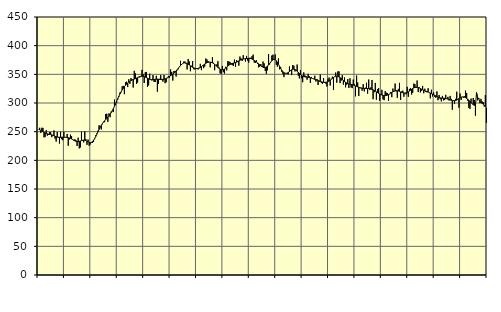
| Category | Piggar | Series 1 |
|---|---|---|
| nan | 254.1 | 253.97 |
| 87.0 | 256.7 | 253.22 |
| 87.0 | 247.8 | 252.1 |
| 87.0 | 256.9 | 250.87 |
| 87.0 | 256.5 | 249.75 |
| 87.0 | 240 | 248.64 |
| 87.0 | 240.9 | 247.76 |
| 87.0 | 252.5 | 246.95 |
| 87.0 | 243 | 246.3 |
| 87.0 | 244.2 | 245.82 |
| 87.0 | 249.1 | 245.36 |
| 87.0 | 249 | 244.92 |
| nan | 240.5 | 244.38 |
| 88.0 | 243 | 243.71 |
| 88.0 | 252 | 242.91 |
| 88.0 | 237.9 | 242.04 |
| 88.0 | 232.8 | 241.24 |
| 88.0 | 249.3 | 240.66 |
| 88.0 | 239.3 | 240.33 |
| 88.0 | 229.3 | 240.18 |
| 88.0 | 249.7 | 240.14 |
| 88.0 | 236.9 | 240.21 |
| 88.0 | 235.1 | 240.29 |
| 88.0 | 249.8 | 240.31 |
| nan | 240.3 | 240.29 |
| 89.0 | 240.4 | 240.16 |
| 89.0 | 246 | 239.9 |
| 89.0 | 225.5 | 239.55 |
| 89.0 | 236.3 | 239.02 |
| 89.0 | 244.7 | 238.26 |
| 89.0 | 242.1 | 237.3 |
| 89.0 | 235.6 | 236.18 |
| 89.0 | 234.3 | 235.02 |
| 89.0 | 237 | 233.95 |
| 89.0 | 235 | 233.15 |
| 89.0 | 225 | 232.72 |
| nan | 239.4 | 232.67 |
| 90.0 | 220.8 | 233.01 |
| 90.0 | 222.5 | 233.62 |
| 90.0 | 250 | 234.34 |
| 90.0 | 234.2 | 235 |
| 90.0 | 231.4 | 235.3 |
| 90.0 | 250.5 | 235.08 |
| 90.0 | 237 | 234.37 |
| 90.0 | 227 | 233.3 |
| 90.0 | 236.3 | 232.1 |
| 90.0 | 225.3 | 231.14 |
| 90.0 | 227.7 | 230.77 |
| nan | 230.2 | 231.25 |
| 91.0 | 230.3 | 232.69 |
| 91.0 | 232 | 235.08 |
| 91.0 | 237 | 238.16 |
| 91.0 | 243.7 | 241.76 |
| 91.0 | 246.8 | 245.72 |
| 91.0 | 251.7 | 249.81 |
| 91.0 | 261.1 | 253.78 |
| 91.0 | 257.1 | 257.51 |
| 91.0 | 253.9 | 260.95 |
| 91.0 | 263 | 263.95 |
| 91.0 | 267.2 | 266.57 |
| nan | 266.5 | 268.9 |
| 92.0 | 280.8 | 271.06 |
| 92.0 | 281.3 | 273.2 |
| 92.0 | 267.2 | 275.41 |
| 92.0 | 282 | 277.79 |
| 92.0 | 275.2 | 280.37 |
| 92.0 | 285 | 283.23 |
| 92.0 | 285.6 | 286.49 |
| 92.0 | 284.1 | 290.18 |
| 92.0 | 306 | 294.26 |
| 92.0 | 296.8 | 298.68 |
| 92.0 | 300.4 | 303.21 |
| nan | 306 | 307.69 |
| 93.0 | 310.7 | 311.95 |
| 93.0 | 318.4 | 315.86 |
| 93.0 | 318.7 | 319.5 |
| 93.0 | 329.1 | 322.84 |
| 93.0 | 329.8 | 325.78 |
| 93.0 | 315.4 | 328.39 |
| 93.0 | 335.9 | 330.75 |
| 93.0 | 337.2 | 332.88 |
| 93.0 | 327.8 | 334.78 |
| 93.0 | 341.4 | 336.42 |
| 93.0 | 333.6 | 337.82 |
| nan | 343.4 | 338.98 |
| 94.0 | 341.2 | 340.01 |
| 94.0 | 327 | 340.92 |
| 94.0 | 356.1 | 341.71 |
| 94.0 | 351.7 | 342.5 |
| 94.0 | 333.2 | 343.4 |
| 94.0 | 335.6 | 344.36 |
| 94.0 | 345.6 | 345.29 |
| 94.0 | 344.6 | 346.03 |
| 94.0 | 346.5 | 346.47 |
| 94.0 | 357.8 | 346.61 |
| 94.0 | 350.2 | 346.41 |
| nan | 334.9 | 345.9 |
| 95.0 | 353.7 | 345.1 |
| 95.0 | 354.2 | 344.17 |
| 95.0 | 328.1 | 343.2 |
| 95.0 | 330.6 | 342.2 |
| 95.0 | 351.1 | 341.38 |
| 95.0 | 341 | 340.9 |
| 95.0 | 339.2 | 340.71 |
| 95.0 | 348.6 | 340.76 |
| 95.0 | 336.7 | 340.99 |
| 95.0 | 336.7 | 341.27 |
| 95.0 | 347.5 | 341.46 |
| nan | 319.8 | 341.56 |
| 96.0 | 333.1 | 341.48 |
| 96.0 | 342.1 | 341.21 |
| 96.0 | 348.6 | 340.96 |
| 96.0 | 342.1 | 340.91 |
| 96.0 | 337.3 | 341.04 |
| 96.0 | 348.8 | 341.37 |
| 96.0 | 334.5 | 341.97 |
| 96.0 | 336.2 | 342.82 |
| 96.0 | 343.4 | 343.86 |
| 96.0 | 347.2 | 345.03 |
| 96.0 | 344.2 | 346.27 |
| nan | 358.6 | 347.56 |
| 97.0 | 354.2 | 348.94 |
| 97.0 | 339.2 | 350.43 |
| 97.0 | 355.8 | 352.04 |
| 97.0 | 356 | 353.85 |
| 97.0 | 346.1 | 355.89 |
| 97.0 | 356.9 | 358.1 |
| 97.0 | 358.8 | 360.47 |
| 97.0 | 363.6 | 362.95 |
| 97.0 | 373.5 | 365.33 |
| 97.0 | 366.4 | 367.38 |
| 97.0 | 368.8 | 368.93 |
| nan | 372.3 | 369.85 |
| 98.0 | 372.4 | 370.08 |
| 98.0 | 368.8 | 369.73 |
| 98.0 | 358.6 | 368.9 |
| 98.0 | 376.7 | 367.66 |
| 98.0 | 372.6 | 366.22 |
| 98.0 | 355.4 | 364.78 |
| 98.0 | 365 | 363.43 |
| 98.0 | 373 | 362.27 |
| 98.0 | 358.9 | 361.3 |
| 98.0 | 358.7 | 360.52 |
| 98.0 | 360.6 | 360.03 |
| nan | 359.3 | 359.87 |
| 99.0 | 358.6 | 360.14 |
| 99.0 | 361.7 | 360.87 |
| 99.0 | 368.3 | 361.98 |
| 99.0 | 357.3 | 363.33 |
| 99.0 | 365.5 | 364.84 |
| 99.0 | 360.8 | 366.45 |
| 99.0 | 363.5 | 368.04 |
| 99.0 | 377.5 | 369.37 |
| 99.0 | 376 | 370.36 |
| 99.0 | 373.3 | 371.03 |
| 99.0 | 371.6 | 371.37 |
| nan | 362.2 | 371.32 |
| 0.0 | 369.9 | 370.88 |
| 0.0 | 379.7 | 370.09 |
| 0.0 | 370.2 | 368.93 |
| 0.0 | 357.2 | 367.5 |
| 0.0 | 365.4 | 365.86 |
| 0.0 | 367.4 | 364.04 |
| 0.0 | 372.8 | 362.17 |
| 0.0 | 362.1 | 360.41 |
| 0.0 | 351.6 | 358.94 |
| 0.0 | 350.9 | 358.01 |
| 0.0 | 364.6 | 357.73 |
| nan | 353.7 | 358.18 |
| 1.0 | 351.3 | 359.25 |
| 1.0 | 363.1 | 360.75 |
| 1.0 | 356.9 | 362.52 |
| 1.0 | 373.2 | 364.37 |
| 1.0 | 372.3 | 366.09 |
| 1.0 | 371.5 | 367.47 |
| 1.0 | 367.1 | 368.43 |
| 1.0 | 366.2 | 369.02 |
| 1.0 | 364.4 | 369.48 |
| 1.0 | 375.8 | 369.93 |
| 1.0 | 363.2 | 370.5 |
| nan | 374.7 | 371.27 |
| 2.0 | 373 | 372.29 |
| 2.0 | 365.1 | 373.45 |
| 2.0 | 381 | 374.58 |
| 2.0 | 377.7 | 375.52 |
| 2.0 | 373.4 | 376.2 |
| 2.0 | 383.4 | 376.68 |
| 2.0 | 376.7 | 377.01 |
| 2.0 | 372.2 | 377.27 |
| 2.0 | 382.1 | 377.51 |
| 2.0 | 374 | 377.72 |
| 2.0 | 370.5 | 377.81 |
| nan | 378.8 | 377.75 |
| 3.0 | 378.9 | 377.39 |
| 3.0 | 381.7 | 376.69 |
| 3.0 | 384.3 | 375.69 |
| 3.0 | 370.6 | 374.44 |
| 3.0 | 369.9 | 373.06 |
| 3.0 | 374.5 | 371.55 |
| 3.0 | 368.1 | 369.93 |
| 3.0 | 362.2 | 368.27 |
| 3.0 | 363.5 | 366.57 |
| 3.0 | 367.9 | 364.91 |
| 3.0 | 364.7 | 363.48 |
| nan | 372.3 | 362.4 |
| 4.0 | 369 | 361.85 |
| 4.0 | 356 | 361.99 |
| 4.0 | 351 | 362.83 |
| 4.0 | 356.9 | 364.37 |
| 4.0 | 385.3 | 366.51 |
| 4.0 | 367.3 | 368.98 |
| 4.0 | 371.3 | 371.49 |
| 4.0 | 382.7 | 373.76 |
| 4.0 | 384.3 | 375.43 |
| 4.0 | 375.4 | 376.14 |
| 4.0 | 384.8 | 375.66 |
| nan | 366.7 | 373.96 |
| 5.0 | 363.2 | 371.16 |
| 5.0 | 377.7 | 367.64 |
| 5.0 | 358.7 | 363.9 |
| 5.0 | 362.9 | 360.3 |
| 5.0 | 354.5 | 357.12 |
| 5.0 | 350.8 | 354.58 |
| 5.0 | 345.2 | 352.85 |
| 5.0 | 351.1 | 351.91 |
| 5.0 | 351.7 | 351.73 |
| 5.0 | 350.2 | 352.31 |
| 5.0 | 350.2 | 353.46 |
| nan | 363.6 | 354.96 |
| 6.0 | 356.2 | 356.6 |
| 6.0 | 348.7 | 358 |
| 6.0 | 366.1 | 358.83 |
| 6.0 | 365 | 358.96 |
| 6.0 | 355 | 358.36 |
| 6.0 | 357.8 | 357.12 |
| 6.0 | 367.1 | 355.42 |
| 6.0 | 347.6 | 353.5 |
| 6.0 | 342.9 | 351.56 |
| 6.0 | 357.3 | 349.77 |
| 6.0 | 343.2 | 348.25 |
| nan | 336.2 | 347.04 |
| 7.0 | 353.4 | 346.15 |
| 7.0 | 348.2 | 345.59 |
| 7.0 | 347 | 345.31 |
| 7.0 | 340.7 | 345.13 |
| 7.0 | 350.9 | 344.9 |
| 7.0 | 347 | 344.57 |
| 7.0 | 335.1 | 344.09 |
| 7.0 | 345.4 | 343.44 |
| 7.0 | 342.8 | 342.74 |
| 7.0 | 342.5 | 342 |
| 7.0 | 347.6 | 341.3 |
| nan | 337.5 | 340.65 |
| 8.0 | 341.8 | 339.97 |
| 8.0 | 331.4 | 339.26 |
| 8.0 | 337.1 | 338.53 |
| 8.0 | 349.6 | 337.8 |
| 8.0 | 334.8 | 337.13 |
| 8.0 | 333.4 | 336.54 |
| 8.0 | 343.2 | 336.14 |
| 8.0 | 334.9 | 336.03 |
| 8.0 | 333.8 | 336.18 |
| 8.0 | 328.8 | 336.57 |
| 8.0 | 341.4 | 337.29 |
| nan | 344.5 | 338.37 |
| 9.0 | 330.5 | 339.76 |
| 9.0 | 342.4 | 341.37 |
| 9.0 | 346 | 343.02 |
| 9.0 | 322.9 | 344.52 |
| 9.0 | 346 | 345.73 |
| 9.0 | 353.1 | 346.51 |
| 9.0 | 335.4 | 346.75 |
| 9.0 | 355 | 346.38 |
| 9.0 | 355.2 | 345.5 |
| 9.0 | 334.7 | 344.24 |
| 9.0 | 339 | 342.67 |
| nan | 348.6 | 340.88 |
| 10.0 | 332.2 | 339.14 |
| 10.0 | 344.5 | 337.54 |
| 10.0 | 327.3 | 336.07 |
| 10.0 | 331.9 | 334.87 |
| 10.0 | 341.7 | 333.99 |
| 10.0 | 326.2 | 333.38 |
| 10.0 | 343.1 | 332.94 |
| 10.0 | 327.1 | 332.54 |
| 10.0 | 325.9 | 332.03 |
| 10.0 | 340.8 | 331.43 |
| 10.0 | 333 | 330.69 |
| nan | 311.6 | 329.84 |
| 11.0 | 347.8 | 328.94 |
| 11.0 | 335.8 | 328.1 |
| 11.0 | 312.3 | 327.32 |
| 11.0 | 325.9 | 326.61 |
| 11.0 | 326.8 | 326.04 |
| 11.0 | 321.5 | 325.66 |
| 11.0 | 332.8 | 325.43 |
| 11.0 | 320.3 | 325.35 |
| 11.0 | 326.6 | 325.4 |
| 11.0 | 335.2 | 325.42 |
| 11.0 | 316.3 | 325.37 |
| nan | 340.9 | 325.26 |
| 12.0 | 322.7 | 324.96 |
| 12.0 | 327.3 | 324.4 |
| 12.0 | 340.1 | 323.73 |
| 12.0 | 306.7 | 322.95 |
| 12.0 | 318.7 | 321.96 |
| 12.0 | 335 | 320.76 |
| 12.0 | 305.7 | 319.48 |
| 12.0 | 324.3 | 318.15 |
| 12.0 | 326.2 | 316.88 |
| 12.0 | 304 | 315.72 |
| 12.0 | 313.7 | 314.73 |
| nan | 323 | 313.97 |
| 13.0 | 306.4 | 313.37 |
| 13.0 | 304.9 | 312.97 |
| 13.0 | 320.7 | 312.87 |
| 13.0 | 318 | 313.13 |
| 13.0 | 317.4 | 313.75 |
| 13.0 | 303.9 | 314.67 |
| 13.0 | 315.4 | 315.8 |
| 13.0 | 319.3 | 317.09 |
| 13.0 | 310.2 | 318.38 |
| 13.0 | 325.2 | 319.58 |
| 13.0 | 320.1 | 320.62 |
| nan | 333.9 | 321.28 |
| 14.0 | 320.2 | 321.55 |
| 14.0 | 309 | 321.45 |
| 14.0 | 324.6 | 320.95 |
| 14.0 | 335.1 | 320.15 |
| 14.0 | 305.2 | 319.27 |
| 14.0 | 320.1 | 318.47 |
| 14.0 | 321.5 | 317.85 |
| 14.0 | 310.9 | 317.48 |
| 14.0 | 317.6 | 317.4 |
| 14.0 | 315 | 317.69 |
| 14.0 | 328.2 | 318.34 |
| nan | 310.8 | 319.38 |
| 15.0 | 324.6 | 320.73 |
| 15.0 | 326.2 | 322.29 |
| 15.0 | 314.7 | 323.89 |
| 15.0 | 317.9 | 325.28 |
| 15.0 | 333.8 | 326.37 |
| 15.0 | 332.9 | 327.14 |
| 15.0 | 326.3 | 327.45 |
| 15.0 | 339.2 | 327.32 |
| 15.0 | 319 | 326.88 |
| 15.0 | 327.3 | 326.13 |
| 15.0 | 318.5 | 325.19 |
| nan | 321.4 | 324.12 |
| 16.0 | 329.8 | 323.09 |
| 16.0 | 317 | 322.14 |
| 16.0 | 324.9 | 321.3 |
| 16.0 | 319.1 | 320.6 |
| 16.0 | 318.7 | 319.91 |
| 16.0 | 325.7 | 319.13 |
| 16.0 | 318.1 | 318.29 |
| 16.0 | 308.1 | 317.36 |
| 16.0 | 323.2 | 316.37 |
| 16.0 | 311.5 | 315.39 |
| 16.0 | 318.4 | 314.39 |
| nan | 310.9 | 313.38 |
| 17.0 | 309.2 | 312.35 |
| 17.0 | 320.2 | 311.34 |
| 17.0 | 304.9 | 310.41 |
| 17.0 | 314 | 309.58 |
| 17.0 | 306.8 | 308.98 |
| 17.0 | 302.9 | 308.61 |
| 17.0 | 312.4 | 308.43 |
| 17.0 | 304.6 | 308.36 |
| 17.0 | 305.1 | 308.21 |
| 17.0 | 314.3 | 307.86 |
| 17.0 | 307.1 | 307.4 |
| nan | 310.7 | 306.81 |
| 18.0 | 304.4 | 306.14 |
| 18.0 | 312.4 | 305.44 |
| 18.0 | 307.2 | 304.78 |
| 18.0 | 288.3 | 304.29 |
| 18.0 | 304.7 | 304 |
| 18.0 | 298.4 | 303.97 |
| 18.0 | 307.3 | 304.3 |
| 18.0 | 319.7 | 305.07 |
| 18.0 | 306.5 | 306.3 |
| 18.0 | 291.9 | 307.74 |
| 18.0 | 316.6 | 309.12 |
| nan | 305.2 | 310.16 |
| 19.0 | 310.5 | 310.66 |
| 19.0 | 309.4 | 310.66 |
| 19.0 | 311.6 | 310.17 |
| 19.0 | 321.6 | 309.31 |
| 19.0 | 317.4 | 308.14 |
| 19.0 | 304 | 306.63 |
| 19.0 | 291.7 | 304.81 |
| 19.0 | 289.7 | 302.74 |
| 19.0 | 307.7 | 300.61 |
| 19.0 | 298.4 | 298.7 |
| 19.0 | 308.8 | 297.09 |
| nan | 305.2 | 295.92 |
| 20.0 | 277.9 | 295.25 |
| 20.0 | 318.5 | 318 |
| 20.0 | 304.5 | 308.66 |
| 20.0 | 307 | 308.3 |
| 20.0 | 299.7 | 301.52 |
| 20.0 | 307.2 | 300.64 |
| 20.0 | 302.9 | 299.52 |
| 20.0 | 301.4 | 298.1 |
| 20.0 | 293.8 | 296.3 |
| 20.0 | 313.8 | 294.07 |
| 20.0 | 265.4 | 291.55 |